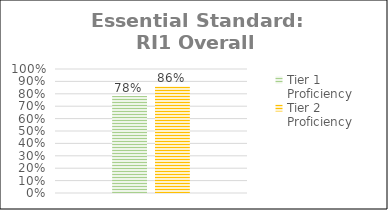
| Category | Tier 1 Proficiency | Tier 2 Proficiency |
|---|---|---|
| 0 | 0.782 | 0.859 |